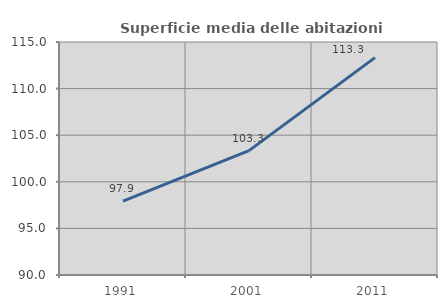
| Category | Superficie media delle abitazioni occupate |
|---|---|
| 1991.0 | 97.927 |
| 2001.0 | 103.342 |
| 2011.0 | 113.323 |